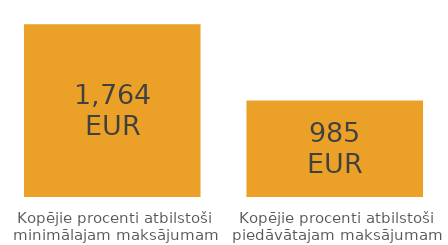
| Category | Series 0 |
|---|---|
| Kopējie procenti atbilstoši minimālajam maksājumam | 1763.952 |
| Kopējie procenti atbilstoši piedāvātajam maksājumam | 984.811 |